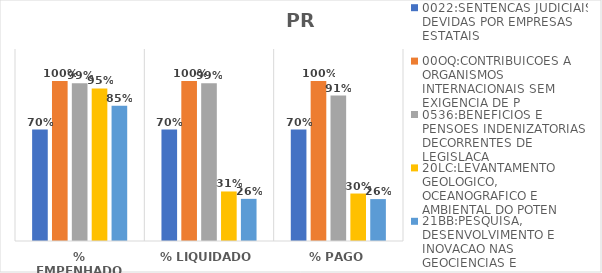
| Category | 0022:SENTENCAS JUDICIAIS DEVIDAS POR EMPRESAS ESTATAIS | 00OQ:CONTRIBUICOES A ORGANISMOS INTERNACIONAIS SEM EXIGENCIA DE P | 0536:BENEFICIOS E PENSOES INDENIZATORIAS DECORRENTES DE LEGISLACA | 20LC:LEVANTAMENTO GEOLOGICO, OCEANOGRAFICO E AMBIENTAL DO POTEN | 21BB:PESQUISA, DESENVOLVIMENTO E INOVACAO NAS GEOCIENCIAS E |
|---|---|---|---|---|---|
| % EMPENHADO | 0.697 | 1 | 0.985 | 0.953 | 0.846 |
| % LIQUIDADO | 0.697 | 1 | 0.985 | 0.31 | 0.263 |
| % PAGO | 0.697 | 1 | 0.909 | 0.297 | 0.262 |